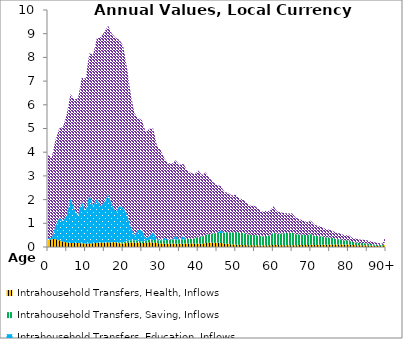
| Category | Intrahousehold Transfers, Health, Inflows | Intrahousehold Transfers, Saving, Inflows | Intrahousehold Transfers, Education, Inflows | Intrahousehold Transfers, Consumption other than health and education, Inflows |
|---|---|---|---|---|
| 0 | 288.613 | 0 | 86.236 | 3498.021 |
|  | 331.105 | 0 | 49.415 | 3407.361 |
| 2 | 338.279 | 0 | 570.743 | 3610.835 |
| 3 | 279.836 | 0 | 962.416 | 3760.704 |
| 4 | 227.271 | 0 | 865.035 | 3979.348 |
| 5 | 186.619 | 0 | 1189.98 | 4224.545 |
| 6 | 168.783 | 0 | 1897.36 | 4391.334 |
| 7 | 172.509 | 0 | 1432.529 | 4615.414 |
| 8 | 166.304 | 0 | 1161.956 | 4947.6 |
| 9 | 159.393 | 0 | 1787.642 | 5205.993 |
| 10 | 143.376 | 0 | 1360.658 | 5591.096 |
| 11 | 148.244 | 0 | 2092.282 | 5935.62 |
| 12 | 155.47 | 0 | 1582.202 | 6370.33 |
| 13 | 177.58 | 0 | 1862.911 | 6762.466 |
| 14 | 186.922 | 0 | 1540.574 | 7125.171 |
| 15 | 187.408 | 0 | 1707.011 | 7171.555 |
| 16 | 187.854 | 0 | 2045.104 | 7105.55 |
| 17 | 198.823 | 2.958 | 1597.806 | 7202.46 |
| 18 | 193.687 | 19.707 | 1259.978 | 7354.698 |
| 19 | 159.351 | 30.95 | 1557.229 | 6991.406 |
| 20 | 149.373 | 58.557 | 1453.401 | 6832.946 |
| 21 | 168.318 | 83.897 | 1150.101 | 6186.188 |
| 22 | 189.768 | 98.163 | 572.832 | 5622.839 |
| 23 | 190.503 | 98.677 | 212.401 | 5148.02 |
| 24 | 181.072 | 79.297 | 464.867 | 4718.072 |
| 25 | 159.517 | 75.726 | 478.658 | 4636.698 |
| 26 | 172.162 | 92.415 | 101.569 | 4483.105 |
| 27 | 198.691 | 109.791 | 149.966 | 4526.715 |
| 28 | 182.834 | 118.935 | 334.983 | 4363.611 |
| 29 | 164.966 | 124 | 58.971 | 3947.695 |
| 30 | 155.677 | 132.771 | 5.235 | 3798.345 |
| 31 | 134.527 | 147.73 | 102.111 | 3347.26 |
| 32 | 138.466 | 167.054 | 6.132 | 3236.562 |
| 33 | 145.202 | 174.446 | 1.443 | 3195.107 |
| 34 | 139.304 | 176.891 | 161.236 | 3181.604 |
| 35 | 136.138 | 178.114 | 2.43 | 3147.546 |
| 36 | 142.997 | 174.049 | 146.15 | 3048.488 |
| 37 | 150.456 | 181.346 | 0 | 2919.684 |
| 38 | 149.084 | 194.898 | 0 | 2791.003 |
| 39 | 144.074 | 221.458 | 0 | 2698.037 |
| 40 | 140.818 | 286.617 | 8.359 | 2791.841 |
| 41 | 134.565 | 307.142 | 2.657 | 2595.471 |
| 42 | 169.025 | 346.801 | 0 | 2631.551 |
| 43 | 184.784 | 362.395 | 0 | 2362.349 |
| 44 | 185.325 | 384.425 | 0 | 2159.757 |
| 45 | 181.361 | 413.461 | 0 | 2015.562 |
| 46 | 169.044 | 425.158 | 114.136 | 1864.218 |
| 47 | 147.141 | 458.641 | 0 | 1711.142 |
| 48 | 131.933 | 499.448 | 0 | 1658.512 |
| 49 | 106.192 | 508.066 | 0 | 1555.814 |
| 50 | 100.183 | 537.092 | 0 | 1579.04 |
| 51 | 88.721 | 508.779 | 0 | 1451.542 |
| 52 | 83.7 | 501.384 | 0 | 1407.192 |
| 53 | 76.713 | 471.695 | 0 | 1311.53 |
| 54 | 71.433 | 436.535 | 0 | 1227.567 |
| 55 | 72.077 | 437.994 | 0 | 1228.993 |
| 56 | 67.89 | 407.465 | 0 | 1132.658 |
| 57 | 65.248 | 378.209 | 0 | 1049.104 |
| 58 | 70.803 | 396.879 | 0 | 1057.681 |
| 59 | 74.672 | 418.47 | 0 | 1020.984 |
| 60 | 88.942 | 510.194 | 0 | 1122.135 |
| 61 | 80.268 | 477.965 | 0 | 949.022 |
| 62 | 77.639 | 489.609 | 0 | 889.859 |
| 63 | 73.661 | 506.714 | 0 | 845.827 |
| 64 | 72.108 | 523.311 | 0 | 822.173 |
| 65 | 75.225 | 535.92 | 0 | 807.968 |
| 66 | 76.744 | 466.016 | 0 | 694.347 |
| 67 | 81.302 | 446.72 | 0 | 638.415 |
| 68 | 82.53 | 440.672 | 0 | 600.505 |
| 69 | 82.047 | 417.08 | 0 | 540.025 |
| 70 | 94.934 | 456.463 | 0 | 562.354 |
| 71 | 86.821 | 387.913 | 0 | 461.071 |
| 72 | 91.011 | 373.452 | 0 | 428.18 |
| 73 | 93.895 | 350.194 | 0 | 390.057 |
| 74 | 94.066 | 315.569 | 0 | 343.178 |
| 75 | 101.959 | 301.826 | 0 | 326.876 |
| 76 | 103.615 | 265.886 | 0 | 292.179 |
| 77 | 104.143 | 229.381 | 0 | 257.345 |
| 78 | 109.037 | 212.035 | 0 | 243.962 |
| 79 | 97.62 | 176.586 | 0 | 210.364 |
| 80 | 106.295 | 182.423 | 0 | 226.47 |
| 81 | 83.756 | 133.228 | 0 | 171.88 |
| 82 | 77.2 | 116.999 | 0 | 157.369 |
| 83 | 70.454 | 101.275 | 0 | 141.63 |
| 84 | 69.751 | 94.827 | 0 | 137.414 |
| 85 | 66.543 | 85.88 | 0 | 127.982 |
| 86 | 57.288 | 70.678 | 0 | 108.396 |
| 87 | 48.464 | 57.448 | 0 | 90.495 |
| 88 | 41.234 | 47.245 | 0 | 76.332 |
| 89 | 34.049 | 37.942 | 0 | 62.833 |
| 90+ | 124.461 | 135.712 | 0 | 230.28 |